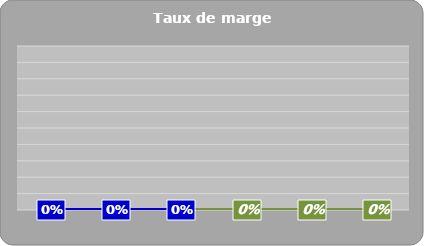
| Category | Series 0 |
|---|---|
|   | 0 |
|   | 0 |
|   | 0 |
|   | 0 |
|   | 0 |
|   | 0 |